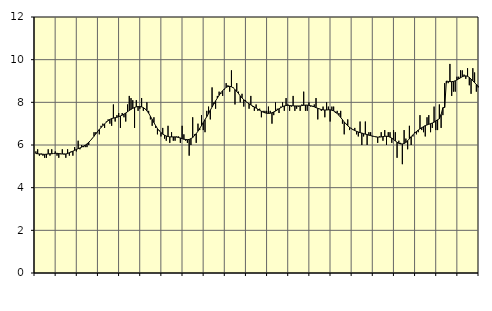
| Category | Piggar | Series 1 |
|---|---|---|
| nan | 5.7 | 5.6 |
| 1.0 | 5.8 | 5.59 |
| 1.0 | 5.5 | 5.58 |
| 1.0 | 5.6 | 5.57 |
| 1.0 | 5.5 | 5.57 |
| 1.0 | 5.4 | 5.56 |
| 1.0 | 5.4 | 5.57 |
| 1.0 | 5.8 | 5.58 |
| 1.0 | 5.5 | 5.59 |
| 1.0 | 5.8 | 5.59 |
| 1.0 | 5.6 | 5.6 |
| 1.0 | 5.7 | 5.61 |
| nan | 5.5 | 5.61 |
| 2.0 | 5.4 | 5.6 |
| 2.0 | 5.6 | 5.58 |
| 2.0 | 5.8 | 5.58 |
| 2.0 | 5.6 | 5.57 |
| 2.0 | 5.4 | 5.58 |
| 2.0 | 5.8 | 5.6 |
| 2.0 | 5.5 | 5.64 |
| 2.0 | 5.7 | 5.67 |
| 2.0 | 5.5 | 5.71 |
| 2.0 | 5.9 | 5.75 |
| 2.0 | 5.7 | 5.79 |
| nan | 6.2 | 5.83 |
| 3.0 | 5.8 | 5.86 |
| 3.0 | 6 | 5.9 |
| 3.0 | 5.9 | 5.95 |
| 3.0 | 5.9 | 5.99 |
| 3.0 | 5.9 | 6.05 |
| 3.0 | 6 | 6.13 |
| 3.0 | 6.2 | 6.21 |
| 3.0 | 6.3 | 6.31 |
| 3.0 | 6.6 | 6.41 |
| 3.0 | 6.6 | 6.52 |
| 3.0 | 6.6 | 6.63 |
| nan | 6.5 | 6.73 |
| 4.0 | 6.9 | 6.82 |
| 4.0 | 7 | 6.91 |
| 4.0 | 6.8 | 6.99 |
| 4.0 | 7.1 | 7.07 |
| 4.0 | 7.2 | 7.14 |
| 4.0 | 7 | 7.2 |
| 4.0 | 6.9 | 7.24 |
| 4.0 | 7.9 | 7.26 |
| 4.0 | 7.1 | 7.28 |
| 4.0 | 7.4 | 7.3 |
| 4.0 | 7.5 | 7.33 |
| nan | 6.8 | 7.36 |
| 5.0 | 7.5 | 7.4 |
| 5.0 | 7.3 | 7.45 |
| 5.0 | 7.1 | 7.5 |
| 5.0 | 7.9 | 7.56 |
| 5.0 | 8.3 | 7.62 |
| 5.0 | 8.2 | 7.67 |
| 5.0 | 8.1 | 7.72 |
| 5.0 | 6.8 | 7.76 |
| 5.0 | 8.1 | 7.79 |
| 5.0 | 7.6 | 7.8 |
| 5.0 | 7.7 | 7.8 |
| nan | 8.2 | 7.79 |
| 6.0 | 7.6 | 7.75 |
| 6.0 | 7.7 | 7.69 |
| 6.0 | 8 | 7.6 |
| 6.0 | 7.6 | 7.49 |
| 6.0 | 7.2 | 7.35 |
| 6.0 | 6.9 | 7.2 |
| 6.0 | 7.3 | 7.05 |
| 6.0 | 6.8 | 6.9 |
| 6.0 | 6.5 | 6.77 |
| 6.0 | 6.7 | 6.67 |
| 6.0 | 6.4 | 6.58 |
| nan | 6.8 | 6.51 |
| 7.0 | 6.3 | 6.46 |
| 7.0 | 6.2 | 6.42 |
| 7.0 | 6.9 | 6.4 |
| 7.0 | 6.1 | 6.38 |
| 7.0 | 6.6 | 6.38 |
| 7.0 | 6.2 | 6.38 |
| 7.0 | 6.2 | 6.38 |
| 7.0 | 6.4 | 6.37 |
| 7.0 | 6.4 | 6.35 |
| 7.0 | 6.1 | 6.33 |
| 7.0 | 6.9 | 6.3 |
| nan | 6.5 | 6.27 |
| 8.0 | 6.2 | 6.26 |
| 8.0 | 6.1 | 6.25 |
| 8.0 | 5.5 | 6.26 |
| 8.0 | 6 | 6.3 |
| 8.0 | 7.3 | 6.35 |
| 8.0 | 6.5 | 6.43 |
| 8.0 | 6.1 | 6.53 |
| 8.0 | 7 | 6.65 |
| 8.0 | 6.7 | 6.78 |
| 8.0 | 7.4 | 6.91 |
| 8.0 | 6.7 | 7.05 |
| nan | 6.6 | 7.19 |
| 9.0 | 7.6 | 7.33 |
| 9.0 | 7.8 | 7.47 |
| 9.0 | 7.2 | 7.63 |
| 9.0 | 8.7 | 7.78 |
| 9.0 | 8 | 7.92 |
| 9.0 | 7.7 | 8.07 |
| 9.0 | 8.3 | 8.2 |
| 9.0 | 8.5 | 8.33 |
| 9.0 | 8.4 | 8.45 |
| 9.0 | 8.3 | 8.55 |
| 9.0 | 8.6 | 8.63 |
| nan | 8.9 | 8.7 |
| 10.0 | 8.8 | 8.74 |
| 10.0 | 8.5 | 8.75 |
| 10.0 | 9.5 | 8.73 |
| 10.0 | 8.7 | 8.68 |
| 10.0 | 7.9 | 8.6 |
| 10.0 | 8.9 | 8.51 |
| 10.0 | 8.5 | 8.41 |
| 10.0 | 8 | 8.3 |
| 10.0 | 8.4 | 8.21 |
| 10.0 | 7.8 | 8.12 |
| 10.0 | 8.1 | 8.05 |
| nan | 8 | 7.99 |
| 11.0 | 7.7 | 7.93 |
| 11.0 | 8.3 | 7.88 |
| 11.0 | 7.8 | 7.83 |
| 11.0 | 7.6 | 7.78 |
| 11.0 | 7.9 | 7.73 |
| 11.0 | 7.6 | 7.68 |
| 11.0 | 7.7 | 7.63 |
| 11.0 | 7.3 | 7.58 |
| 11.0 | 7.6 | 7.54 |
| 11.0 | 7.6 | 7.51 |
| 11.0 | 7.6 | 7.49 |
| nan | 7.8 | 7.48 |
| 12.0 | 7.6 | 7.49 |
| 12.0 | 7 | 7.51 |
| 12.0 | 7.4 | 7.55 |
| 12.0 | 8 | 7.59 |
| 12.0 | 7.7 | 7.64 |
| 12.0 | 7.5 | 7.7 |
| 12.0 | 7.8 | 7.75 |
| 12.0 | 8 | 7.8 |
| 12.0 | 7.6 | 7.83 |
| 12.0 | 8.2 | 7.85 |
| 12.0 | 7.9 | 7.86 |
| nan | 7.6 | 7.85 |
| 13.0 | 7.8 | 7.84 |
| 13.0 | 8.3 | 7.84 |
| 13.0 | 7.6 | 7.83 |
| 13.0 | 7.7 | 7.83 |
| 13.0 | 7.8 | 7.83 |
| 13.0 | 7.6 | 7.83 |
| 13.0 | 7.9 | 7.85 |
| 13.0 | 8.5 | 7.86 |
| 13.0 | 7.6 | 7.87 |
| 13.0 | 7.6 | 7.87 |
| 13.0 | 8 | 7.86 |
| nan | 7.8 | 7.84 |
| 14.0 | 7.8 | 7.82 |
| 14.0 | 7.9 | 7.79 |
| 14.0 | 8.2 | 7.75 |
| 14.0 | 7.2 | 7.72 |
| 14.0 | 7.7 | 7.69 |
| 14.0 | 7.6 | 7.66 |
| 14.0 | 7.8 | 7.65 |
| 14.0 | 7.3 | 7.64 |
| 14.0 | 8 | 7.64 |
| 14.0 | 7.8 | 7.65 |
| 14.0 | 7.1 | 7.65 |
| nan | 7.8 | 7.63 |
| 15.0 | 7.8 | 7.6 |
| 15.0 | 7.5 | 7.55 |
| 15.0 | 7.6 | 7.48 |
| 15.0 | 7.5 | 7.39 |
| 15.0 | 7.6 | 7.29 |
| 15.0 | 7 | 7.19 |
| 15.0 | 6.5 | 7.08 |
| 15.0 | 7 | 6.99 |
| 15.0 | 7.2 | 6.9 |
| 15.0 | 6.7 | 6.83 |
| 15.0 | 6.8 | 6.77 |
| nan | 6.7 | 6.72 |
| 16.0 | 6.8 | 6.68 |
| 16.0 | 6.5 | 6.64 |
| 16.0 | 6.4 | 6.61 |
| 16.0 | 7.1 | 6.58 |
| 16.0 | 6 | 6.56 |
| 16.0 | 6.4 | 6.53 |
| 16.0 | 7.1 | 6.51 |
| 16.0 | 6 | 6.49 |
| 16.0 | 6.6 | 6.46 |
| 16.0 | 6.6 | 6.44 |
| 16.0 | 6.4 | 6.42 |
| nan | 6.4 | 6.4 |
| 17.0 | 6.4 | 6.38 |
| 17.0 | 6.1 | 6.37 |
| 17.0 | 6.4 | 6.37 |
| 17.0 | 6.6 | 6.38 |
| 17.0 | 6.2 | 6.39 |
| 17.0 | 6.7 | 6.41 |
| 17.0 | 6 | 6.41 |
| 17.0 | 6.6 | 6.4 |
| 17.0 | 6.6 | 6.37 |
| 17.0 | 6.1 | 6.32 |
| 17.0 | 6.7 | 6.26 |
| nan | 6.6 | 6.19 |
| 18.0 | 5.4 | 6.13 |
| 18.0 | 6.2 | 6.08 |
| 18.0 | 6.1 | 6.05 |
| 18.0 | 5.1 | 6.05 |
| 18.0 | 6.7 | 6.07 |
| 18.0 | 6.3 | 6.12 |
| 18.0 | 5.8 | 6.2 |
| 18.0 | 6.9 | 6.29 |
| 18.0 | 6 | 6.39 |
| 18.0 | 6.4 | 6.48 |
| 18.0 | 6.6 | 6.56 |
| nan | 6.5 | 6.63 |
| 19.0 | 6.6 | 6.7 |
| 19.0 | 7.4 | 6.76 |
| 19.0 | 6.7 | 6.81 |
| 19.0 | 6.6 | 6.86 |
| 19.0 | 6.4 | 6.91 |
| 19.0 | 7.3 | 6.94 |
| 19.0 | 7.4 | 6.97 |
| 19.0 | 6.6 | 7 |
| 19.0 | 6.8 | 7.03 |
| 19.0 | 7.8 | 7.07 |
| 19.0 | 6.7 | 7.13 |
| nan | 6.7 | 7.18 |
| 20.0 | 7.9 | 7.23 |
| 20.0 | 6.8 | 7.43 |
| 20.0 | 7.4 | 7.75 |
| 20.0 | 8.9 | 7.76 |
| 20.0 | 8.9 | 9 |
| 20.0 | 8.9 | 8.98 |
| 20.0 | 9.8 | 8.97 |
| 20.0 | 8.3 | 8.97 |
| 20.0 | 8.5 | 8.98 |
| 20.0 | 8.5 | 9.01 |
| 20.0 | 9.2 | 9.05 |
| nan | 9.2 | 9.1 |
| 21.0 | 9.5 | 9.15 |
| 21.0 | 9.5 | 9.2 |
| 21.0 | 9.3 | 9.23 |
| 21.0 | 9.1 | 9.24 |
| 21.0 | 9.6 | 9.22 |
| 21.0 | 8.8 | 9.17 |
| 21.0 | 8.4 | 9.09 |
| 21.0 | 9.6 | 9.01 |
| 21.0 | 9.4 | 8.92 |
| 21.0 | 8.5 | 8.84 |
| 21.0 | 8.7 | 8.77 |